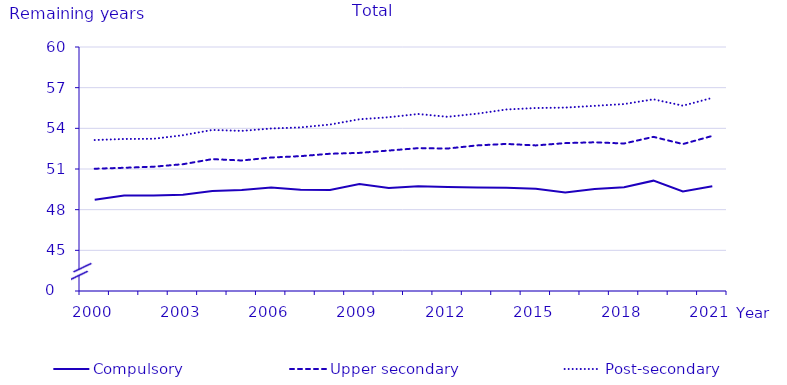
| Category | Compulsory | Upper secondary | Post-secondary |
|---|---|---|---|
| 2000.0 | 48.731 | 51.02 | 53.137 |
| 2001.0 | 49.05 | 51.09 | 53.215 |
| 2002.0 | 49.047 | 51.169 | 53.227 |
| 2003.0 | 49.095 | 51.354 | 53.494 |
| 2004.0 | 49.374 | 51.728 | 53.879 |
| 2005.0 | 49.45 | 51.628 | 53.812 |
| 2006.0 | 49.641 | 51.846 | 53.988 |
| 2007.0 | 49.465 | 51.948 | 54.069 |
| 2008.0 | 49.458 | 52.125 | 54.278 |
| 2009.0 | 49.886 | 52.189 | 54.669 |
| 2010.0 | 49.592 | 52.36 | 54.819 |
| 2011.0 | 49.723 | 52.538 | 55.057 |
| 2012.0 | 49.68 | 52.51 | 54.85 |
| 2013.0 | 49.63 | 52.74 | 55.08 |
| 2014.0 | 49.61 | 52.85 | 55.39 |
| 2015.0 | 49.54 | 52.74 | 55.5 |
| 2016.0 | 49.27 | 52.91 | 55.53 |
| 2017.0 | 49.53 | 52.97 | 55.66 |
| 2018.0 | 49.66 | 52.88 | 55.79 |
| 2019.0 | 50.14 | 53.37 | 56.14 |
| 2020.0 | 49.34 | 52.84 | 55.67 |
| 2021.0 | 49.72 | 53.44 | 56.25 |